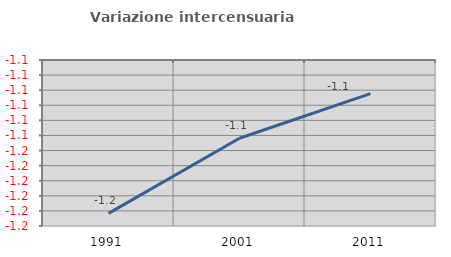
| Category | Variazione intercensuaria annua |
|---|---|
| 1991.0 | -1.192 |
| 2001.0 | -1.142 |
| 2011.0 | -1.112 |